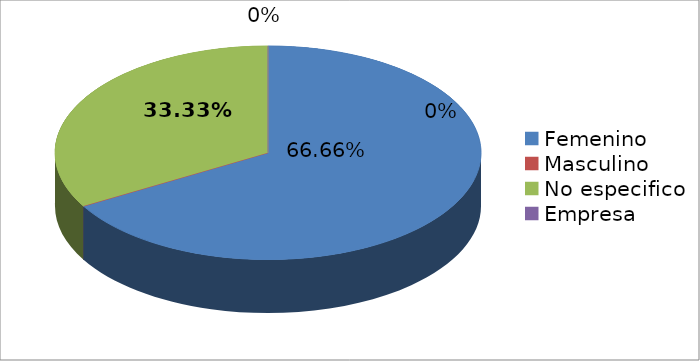
| Category | Series 0 |
|---|---|
| Femenino | 2 |
| Masculino | 0 |
| No especifico | 1 |
| Empresa | 0 |